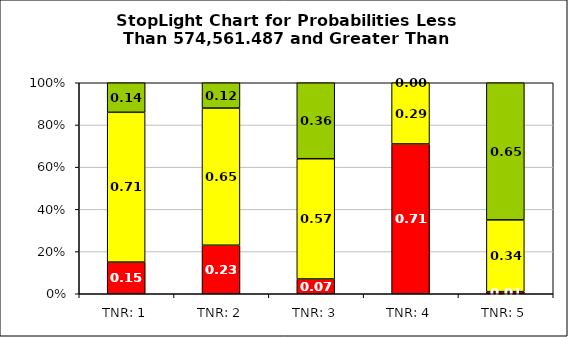
| Category | Series 0 | Series 1 | Series 2 |
|---|---|---|---|
| TNR: 1 | 0.15 | 0.71 | 0.14 |
| TNR: 2 | 0.23 | 0.65 | 0.12 |
| TNR: 3 | 0.07 | 0.57 | 0.36 |
| TNR: 4 | 0.71 | 0.29 | 0 |
| TNR: 5 | 0.01 | 0.34 | 0.65 |